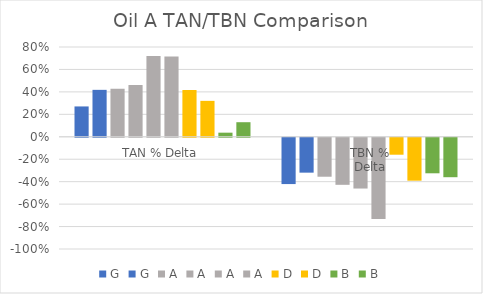
| Category | G | A | D | B |
|---|---|---|---|---|
| TAN % Delta | 0.418 | 0.714 | 0.32 | 0.13 |
| TBN %
Delta | -0.311 | -0.725 | -0.382 | -0.351 |